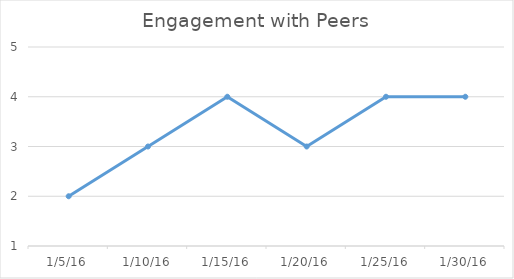
| Category | Series 0 |
|---|---|
| 1/5/16 | 2 |
| 1/10/16 | 3 |
| 1/15/16 | 4 |
| 1/20/16 | 3 |
| 1/25/16 | 4 |
| 1/30/16 | 4 |